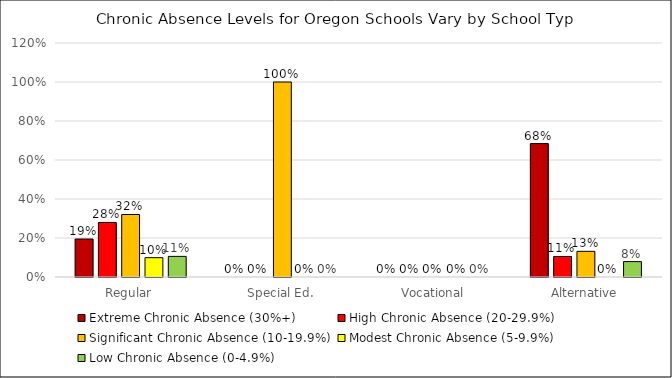
| Category | Extreme Chronic Absence (30%+) | High Chronic Absence (20-29.9%) | Significant Chronic Absence (10-19.9%) | Modest Chronic Absence (5-9.9%) | Low Chronic Absence (0-4.9%) |
|---|---|---|---|---|---|
| Regular | 0.195 | 0.28 | 0.321 | 0.099 | 0.106 |
| Special Ed. | 0 | 0 | 1 | 0 | 0 |
| Vocational | 0 | 0 | 0 | 0 | 0 |
| Alternative | 0.684 | 0.105 | 0.132 | 0 | 0.079 |